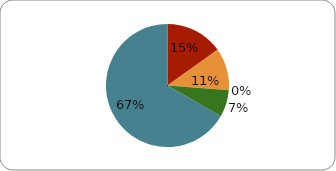
| Category | Series 0 |
|---|---|
| 0 | 0.15 |
| 1 | 0.11 |
| 2 | 0 |
| 3 | 0.07 |
| 4 | 0.66 |